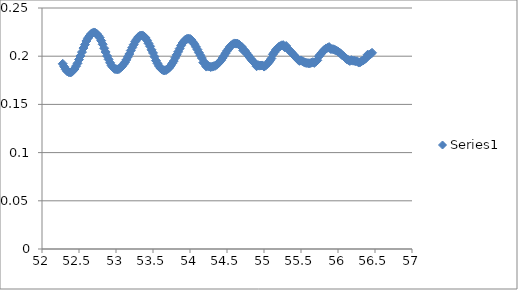
| Category | Series 0 |
|---|---|
| 52.28 | 0.192 |
| 52.3 | 0.189 |
| 52.32 | 0.186 |
| 52.34 | 0.184 |
| 52.36 | 0.184 |
| 52.38 | 0.183 |
| 52.4 | 0.184 |
| 52.42 | 0.185 |
| 52.44 | 0.187 |
| 52.46 | 0.19 |
| 52.48 | 0.193 |
| 52.5 | 0.197 |
| 52.52 | 0.2 |
| 52.54 | 0.204 |
| 52.56 | 0.208 |
| 52.58 | 0.212 |
| 52.6 | 0.216 |
| 52.62 | 0.219 |
| 52.64 | 0.221 |
| 52.66 | 0.223 |
| 52.68 | 0.224 |
| 52.7 | 0.225 |
| 52.72 | 0.224 |
| 52.74 | 0.223 |
| 52.76 | 0.221 |
| 52.78 | 0.219 |
| 52.8 | 0.216 |
| 52.82 | 0.212 |
| 52.84 | 0.208 |
| 52.86 | 0.204 |
| 52.88 | 0.2 |
| 52.9 | 0.197 |
| 52.92 | 0.193 |
| 52.94 | 0.19 |
| 52.96 | 0.189 |
| 52.98 | 0.187 |
| 53.0 | 0.186 |
| 53.02 | 0.186 |
| 53.04 | 0.187 |
| 53.06 | 0.188 |
| 53.08 | 0.189 |
| 53.1 | 0.191 |
| 53.12 | 0.194 |
| 53.14 | 0.196 |
| 53.16 | 0.199 |
| 53.18 | 0.202 |
| 53.2 | 0.206 |
| 53.22 | 0.209 |
| 53.24 | 0.212 |
| 53.26 | 0.215 |
| 53.28 | 0.217 |
| 53.3 | 0.22 |
| 53.32 | 0.221 |
| 53.34 | 0.221 |
| 53.36 | 0.222 |
| 53.38 | 0.22 |
| 53.4 | 0.219 |
| 53.42 | 0.216 |
| 53.44 | 0.213 |
| 53.46 | 0.21 |
| 53.48 | 0.207 |
| 53.5 | 0.203 |
| 53.52 | 0.199 |
| 53.54 | 0.195 |
| 53.56 | 0.193 |
| 53.58 | 0.19 |
| 53.6 | 0.188 |
| 53.62 | 0.186 |
| 53.64 | 0.185 |
| 53.66 | 0.185 |
| 53.68 | 0.186 |
| 53.7 | 0.187 |
| 53.72 | 0.188 |
| 53.74 | 0.19 |
| 53.76 | 0.193 |
| 53.78 | 0.195 |
| 53.8 | 0.198 |
| 53.82 | 0.201 |
| 53.84 | 0.205 |
| 53.86 | 0.208 |
| 53.88 | 0.211 |
| 53.9 | 0.214 |
| 53.92 | 0.216 |
| 53.94 | 0.217 |
| 53.96 | 0.218 |
| 53.98 | 0.218 |
| 54.0 | 0.218 |
| 54.02 | 0.217 |
| 54.04 | 0.215 |
| 54.06 | 0.212 |
| 54.08 | 0.21 |
| 54.1 | 0.207 |
| 54.12 | 0.204 |
| 54.14 | 0.201 |
| 54.16 | 0.198 |
| 54.18 | 0.193 |
| 54.2 | 0.193 |
| 54.22 | 0.189 |
| 54.24 | 0.19 |
| 54.26 | 0.189 |
| 54.28 | 0.189 |
| 54.3 | 0.189 |
| 54.32 | 0.19 |
| 54.34 | 0.19 |
| 54.36 | 0.191 |
| 54.38 | 0.192 |
| 54.4 | 0.194 |
| 54.42 | 0.196 |
| 54.44 | 0.198 |
| 54.46 | 0.2 |
| 54.48 | 0.203 |
| 54.5 | 0.206 |
| 54.52 | 0.208 |
| 54.54 | 0.21 |
| 54.56 | 0.211 |
| 54.58 | 0.212 |
| 54.6 | 0.213 |
| 54.62 | 0.213 |
| 54.64 | 0.213 |
| 54.66 | 0.212 |
| 54.68 | 0.211 |
| 54.7 | 0.21 |
| 54.72 | 0.206 |
| 54.74 | 0.206 |
| 54.76 | 0.204 |
| 54.78 | 0.201 |
| 54.8 | 0.2 |
| 54.82 | 0.197 |
| 54.84 | 0.195 |
| 54.86 | 0.194 |
| 54.88 | 0.192 |
| 54.9 | 0.19 |
| 54.92 | 0.191 |
| 54.94 | 0.19 |
| 54.96 | 0.19 |
| 54.98 | 0.19 |
| 55.0 | 0.189 |
| 55.02 | 0.19 |
| 55.04 | 0.192 |
| 55.06 | 0.193 |
| 55.08 | 0.195 |
| 55.1 | 0.198 |
| 55.12 | 0.202 |
| 55.14 | 0.204 |
| 55.16 | 0.206 |
| 55.18 | 0.208 |
| 55.2 | 0.21 |
| 55.22 | 0.21 |
| 55.24 | 0.211 |
| 55.26 | 0.211 |
| 55.28 | 0.209 |
| 55.3 | 0.211 |
| 55.32 | 0.208 |
| 55.34 | 0.206 |
| 55.36 | 0.205 |
| 55.38 | 0.203 |
| 55.4 | 0.202 |
| 55.42 | 0.2 |
| 55.44 | 0.198 |
| 55.46 | 0.196 |
| 55.48 | 0.195 |
| 55.5 | 0.196 |
| 55.52 | 0.195 |
| 55.54 | 0.194 |
| 55.56 | 0.193 |
| 55.58 | 0.193 |
| 55.6 | 0.193 |
| 55.62 | 0.193 |
| 55.64 | 0.193 |
| 55.66 | 0.194 |
| 55.68 | 0.193 |
| 55.7 | 0.194 |
| 55.72 | 0.196 |
| 55.74 | 0.2 |
| 55.76 | 0.202 |
| 55.78 | 0.203 |
| 55.8 | 0.205 |
| 55.82 | 0.207 |
| 55.84 | 0.208 |
| 55.86 | 0.209 |
| 55.88 | 0.209 |
| 55.9 | 0.208 |
| 55.92 | 0.207 |
| 55.94 | 0.207 |
| 55.96 | 0.206 |
| 55.98 | 0.206 |
| 56.0 | 0.205 |
| 56.02 | 0.204 |
| 56.04 | 0.202 |
| 56.06 | 0.201 |
| 56.08 | 0.2 |
| 56.1 | 0.198 |
| 56.12 | 0.197 |
| 56.14 | 0.196 |
| 56.16 | 0.195 |
| 56.18 | 0.196 |
| 56.2 | 0.195 |
| 56.22 | 0.195 |
| 56.24 | 0.195 |
| 56.26 | 0.195 |
| 56.28 | 0.193 |
| 56.3 | 0.194 |
| 56.32 | 0.195 |
| 56.34 | 0.196 |
| 56.36 | 0.197 |
| 56.38 | 0.198 |
| 56.4 | 0.201 |
| 56.42 | 0.201 |
| 56.44 | 0.202 |
| 56.46 | 0.204 |